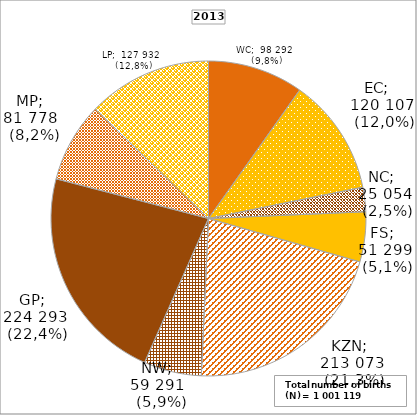
| Category | Series 0 | Series 1 |
|---|---|---|
| WC | 98292 | 9.818 |
| EC | 120107 | 11.997 |
| NC | 25054 | 2.503 |
| FS | 51299 | 5.124 |
| KZN | 213073 | 21.283 |
| NW | 59291 | 5.922 |
| GP | 224293 | 22.404 |
| MP | 81778 | 8.169 |
| LP | 127932 | 12.779 |